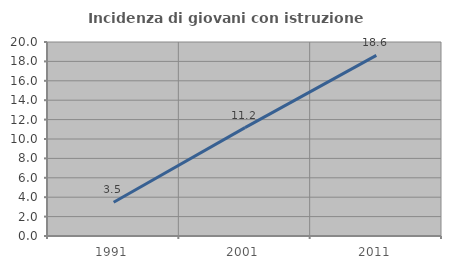
| Category | Incidenza di giovani con istruzione universitaria |
|---|---|
| 1991.0 | 3.478 |
| 2001.0 | 11.176 |
| 2011.0 | 18.621 |